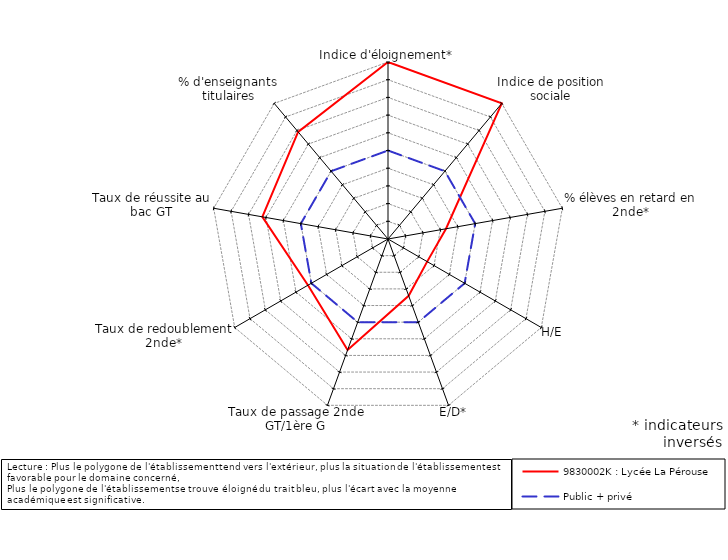
| Category | 9830002K : Lycée La Pérouse | Public + privé |
|---|---|---|
| Indice d'éloignement* | 5 | 0 |
| Indice de position sociale | 5 | 0 |
| % élèves en retard en 2nde* | -1.672 | 0 |
| H/E | -2.445 | 0 |
| E/D* | -1.587 | 0 |
| Taux de passage 2nde GT/1ère G | 1.677 | 0 |
| Taux de redoublement 2nde* | 0.219 | 0 |
| Taux de réussite au bac GT | 2.209 | 0 |
| % d'enseignants titulaires | 2.9 | 0 |